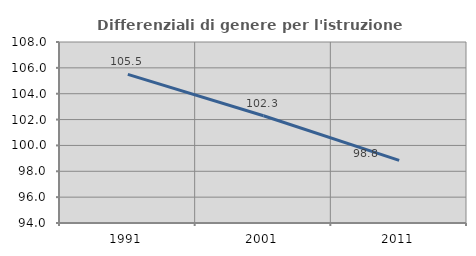
| Category | Differenziali di genere per l'istruzione superiore |
|---|---|
| 1991.0 | 105.491 |
| 2001.0 | 102.297 |
| 2011.0 | 98.848 |